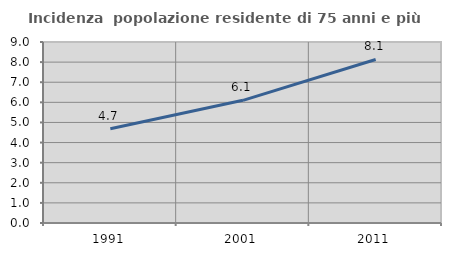
| Category | Incidenza  popolazione residente di 75 anni e più |
|---|---|
| 1991.0 | 4.685 |
| 2001.0 | 6.1 |
| 2011.0 | 8.131 |